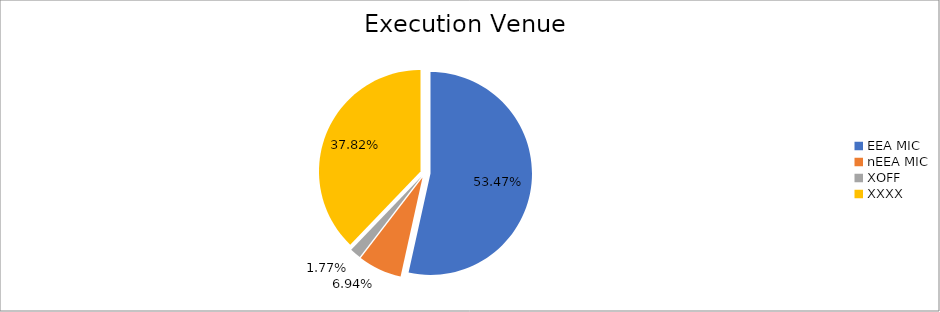
| Category | Series 0 |
|---|---|
| EEA MIC | 7188206.549 |
| nEEA MIC | 933509.856 |
| XOFF | 237497.997 |
| XXXX | 5085199.841 |